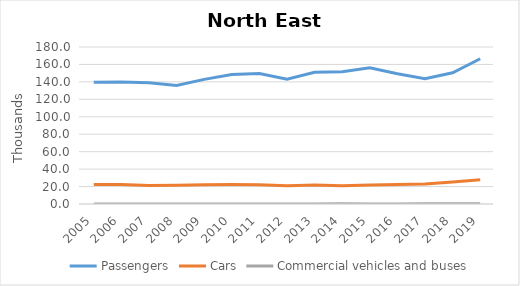
| Category | Passengers | Cars | Commercial vehicles and buses |
|---|---|---|---|
| 2005.0 | 139.6 | 22.4 | 0 |
| 2006.0 | 139.9 | 22.3 | 0 |
| 2007.0 | 138.9 | 21.1 | 0 |
| 2008.0 | 135.8 | 21.6 | 0 |
| 2009.0 | 142.9 | 22 | 0 |
| 2010.0 | 148.4 | 22.3 | 0 |
| 2011.0 | 149.7 | 22.2 | 0 |
| 2012.0 | 143 | 20.9 | 0 |
| 2013.0 | 150.979 | 21.7 | 0.142 |
| 2014.0 | 151.506 | 20.8 | 0.148 |
| 2015.0 | 156.136 | 21.9 | 0.137 |
| 2016.0 | 149.228 | 22.4 | 0.137 |
| 2017.0 | 143.62 | 22.954 | 0.163 |
| 2018.0 | 150.417 | 25.105 | 0.152 |
| 2019.0 | 166.534 | 27.819 | 0.149 |